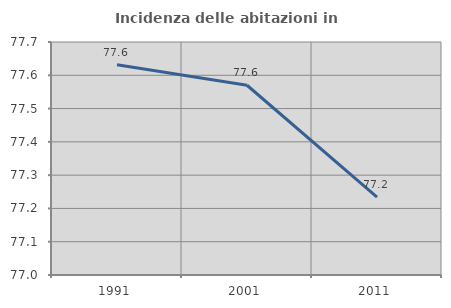
| Category | Incidenza delle abitazioni in proprietà  |
|---|---|
| 1991.0 | 77.632 |
| 2001.0 | 77.57 |
| 2011.0 | 77.234 |